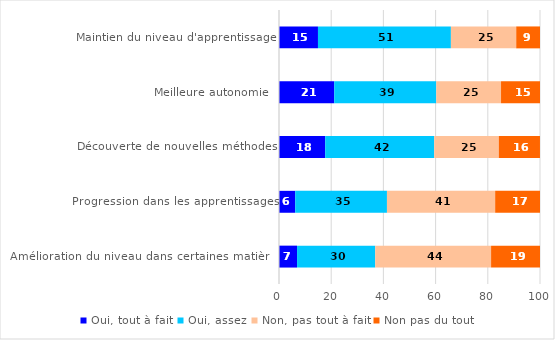
| Category | Oui, tout à fait | Oui, assez | Non, pas tout à fait | Non pas du tout |
|---|---|---|---|---|
| Maintien du niveau d'apprentissage | 14.93 | 50.93 | 25.03 | 9.11 |
| Meilleure autonomie  | 21.16 | 39.1 | 24.81 | 14.93 |
| Découverte de nouvelles méthodes | 17.7 | 41.77 | 24.75 | 15.77 |
| Progression dans les apprentissages | 6.21 | 35.15 | 41.46 | 17.18 |
| Amélioration du niveau dans certaines matières | 6.92 | 29.95 | 44.39 | 18.74 |